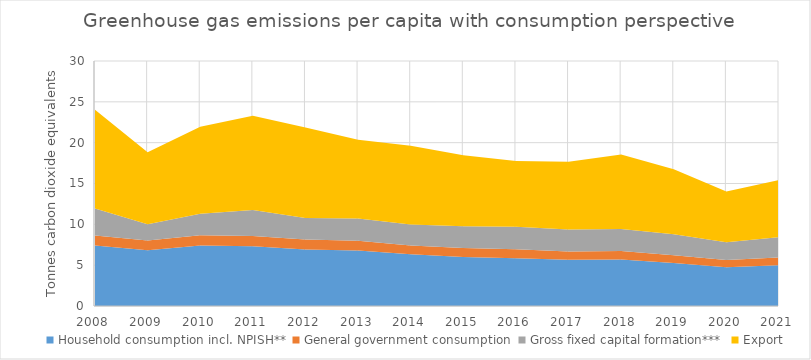
| Category | Household consumption incl. NPISH** | General government consumption | Gross fixed capital formation*** | Export |
|---|---|---|---|---|
| 2008.0 | 7.403 | 1.239 | 3.309 | 12.078 |
| 2009.0 | 6.837 | 1.193 | 1.965 | 8.84 |
| 2010.0 | 7.396 | 1.255 | 2.633 | 10.673 |
| 2011.0 | 7.331 | 1.253 | 3.179 | 11.531 |
| 2012.0 | 6.931 | 1.199 | 2.66 | 11.071 |
| 2013.0 | 6.8 | 1.195 | 2.712 | 9.642 |
| 2014.0 | 6.347 | 1.073 | 2.552 | 9.639 |
| 2015.0 | 6.014 | 1.086 | 2.679 | 8.664 |
| 2016.0 | 5.859 | 1.083 | 2.776 | 8.033 |
| 2017.0 | 5.669 | 1.007 | 2.681 | 8.311 |
| 2018.0 | 5.702 | 1.032 | 2.701 | 9.115 |
| 2019.0 | 5.269 | 0.936 | 2.595 | 7.942 |
| 2020.0 | 4.732 | 0.894 | 2.18 | 6.217 |
| 2021.0 | 4.999 | 0.943 | 2.496 | 7 |